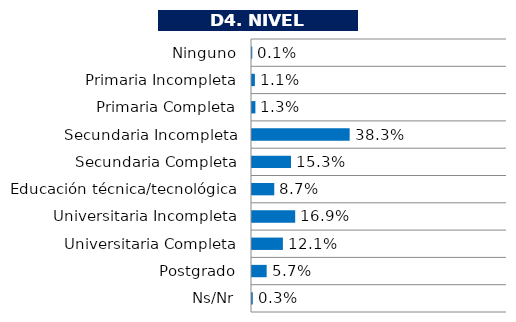
| Category | Series 0 |
|---|---|
| Ninguno | 0.001 |
| Primaria Incompleta | 0.011 |
| Primaria Completa | 0.013 |
| Secundaria Incompleta | 0.383 |
| Secundaria Completa | 0.153 |
| Educación técnica/tecnológica | 0.087 |
| Universitaria Incompleta | 0.169 |
| Universitaria Completa | 0.121 |
| Postgrado | 0.057 |
| Ns/Nr | 0.003 |